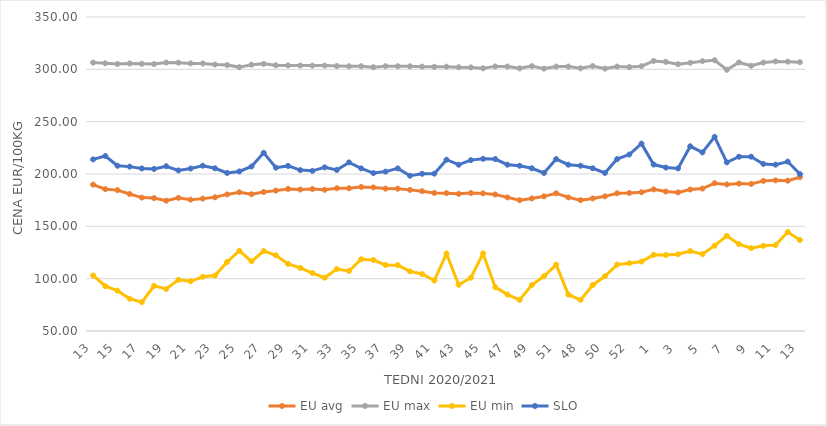
| Category | EU avg | EU max | EU min | SLO |
|---|---|---|---|---|
| 13.0 | 189.839 | 306.44 | 103.04 | 213.96 |
| 14.0 | 185.504 | 305.8 | 92.836 | 217.19 |
| 15.0 | 184.591 | 305.08 | 88.508 | 207.87 |
| 16.0 | 180.892 | 305.63 | 80.873 | 207.05 |
| 17.0 | 177.437 | 305.27 | 77.506 | 205.29 |
| 18.0 | 176.995 | 305.01 | 93.104 | 204.82 |
| 19.0 | 174.49 | 306.49 | 90.169 | 207.44 |
| 20.0 | 177.204 | 306.38 | 98.928 | 203.41 |
| 21.0 | 175.519 | 305.66 | 97.454 | 205.19 |
| 22.0 | 176.473 | 305.64 | 101.792 | 207.91 |
| 23.0 | 177.741 | 304.59 | 102.918 | 205.46 |
| 24.0 | 180.501 | 304.1 | 115.936 | 201 |
| 25.0 | 182.568 | 302.13 | 126.655 | 202.43 |
| 26.0 | 180.667 | 304.43 | 116.597 | 207.19 |
| 27.0 | 182.833 | 305.22 | 126.397 | 220.25 |
| 28.0 | 184.121 | 303.88 | 122.317 | 206.06 |
| 29.0 | 185.712 | 303.73 | 114.082 | 207.73 |
| 30.0 | 185.141 | 303.63 | 110.314 | 203.73 |
| 31.0 | 185.621 | 303.57 | 105.336 | 203 |
| 32.0 | 184.887 | 303.58 | 100.908 | 206.36 |
| 33.0 | 186.411 | 303.17 | 109.191 | 203.88 |
| 34.0 | 186.338 | 302.96 | 107.355 | 211.07 |
| 35.0 | 187.628 | 302.99 | 118.534 | 205.34 |
| 36.0 | 187.19 | 302.05 | 117.814 | 200.88 |
| 37.0 | 186.038 | 302.98 | 113.058 | 202.29 |
| 38.0 | 185.986 | 302.94 | 112.896 | 205.33 |
| 39.0 | 184.836 | 302.88 | 106.953 | 198.33 |
| 40.0 | 183.595 | 302.56 | 104.426 | 200.21 |
| 41.0 | 181.893 | 302.44 | 98.23 | 200.3 |
| 42.0 | 181.671 | 302.52 | 123.908 | 213.66 |
| 43.0 | 181.023 | 302.01 | 94.177 | 208.86 |
| 44.0 | 181.795 | 301.86 | 100.908 | 213.25 |
| 45.0 | 181.489 | 300.98 | 124 | 214.51 |
| 46.0 | 180.473 | 302.82 | 91.889 | 214.27 |
| 47.0 | 177.656 | 302.7 | 84.832 | 208.87 |
| 48.0 | 174.977 | 300.94 | 79.697 | 207.9 |
| 49.0 | 176.65 | 303.09 | 93.873 | 205.48 |
| 50.0 | 178.648 | 300.7 | 102.316 | 200.99 |
| 51.0 | 181.58 | 302.62 | 113.46 | 214.25 |
| 47.0 | 177.656 | 302.7 | 84.832 | 208.87 |
| 48.0 | 174.977 | 300.94 | 79.697 | 207.9 |
| 49.0 | 176.65 | 303.09 | 93.873 | 205.48 |
| 50.0 | 178.648 | 300.7 | 102.316 | 200.99 |
| 51.0 | 181.58 | 302.62 | 113.46 | 214.25 |
| 52.0 | 181.9 | 302.14 | 114.76 | 218.61 |
| 53.0 | 182.536 | 303 | 116.375 | 229 |
| 1.0 | 185.3 | 308 | 122.769 | 209 |
| 2.0 | 183.25 | 307.1 | 122.609 | 206.15 |
| 3.0 | 182.393 | 304.91 | 123.32 | 205.35 |
| 4.0 | 185.158 | 306.22 | 126.329 | 226.48 |
| 5.0 | 186.04 | 307.79 | 123.461 | 220.65 |
| 6.0 | 191.206 | 308.7 | 131.528 | 235.46 |
| 7.0 | 190.028 | 299.55 | 140.902 | 211.1 |
| 8.0 | 190.875 | 306.55 | 132.97 | 216.51 |
| 9.0 | 190.519 | 303.4 | 129.173 | 216.54 |
| 10.0 | 193.416 | 306.48 | 131.374 | 209.61 |
| 11.0 | 193.936 | 307.58 | 132.024 | 208.91 |
| 12.0 | 193.599 | 307.33 | 144.506 | 211.87 |
| 13.0 | 196.932 | 306.85 | 136.936 | 199.93 |